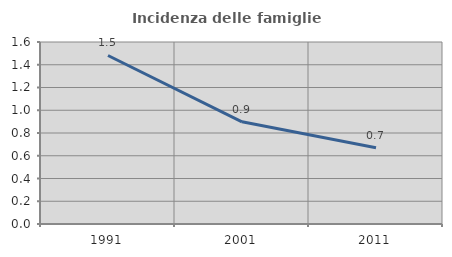
| Category | Incidenza delle famiglie numerose |
|---|---|
| 1991.0 | 1.481 |
| 2001.0 | 0.898 |
| 2011.0 | 0.67 |